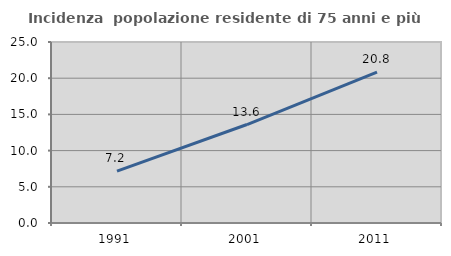
| Category | Incidenza  popolazione residente di 75 anni e più |
|---|---|
| 1991.0 | 7.171 |
| 2001.0 | 13.6 |
| 2011.0 | 20.825 |